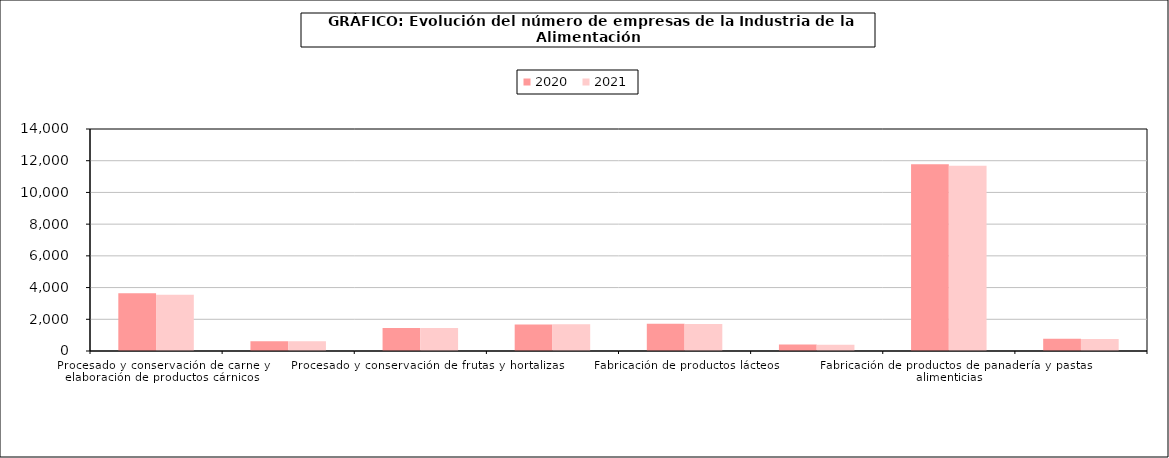
| Category | 2020 | 2021 |
|---|---|---|
| Procesado y conservación de carne y elaboración de productos cárnicos | 3641 | 3554 |
| Procesado y conservación de pescados, crustáceos y moluscos | 619 | 610 |
| Procesado y conservación de frutas y hortalizas | 1456 | 1452 |
| Fabricación de aceites y grasas vegetales y animales | 1670 | 1689 |
| Fabricación de productos lácteos | 1726 | 1695 |
| Fabricación de productos de molinería, almidones y productos amiláceos | 407 | 389 |
| Fabricación de productos de panadería y pastas alimenticias | 11778 | 11676 |
| Fabricación de productos para la alimentación animal | 775 | 764 |